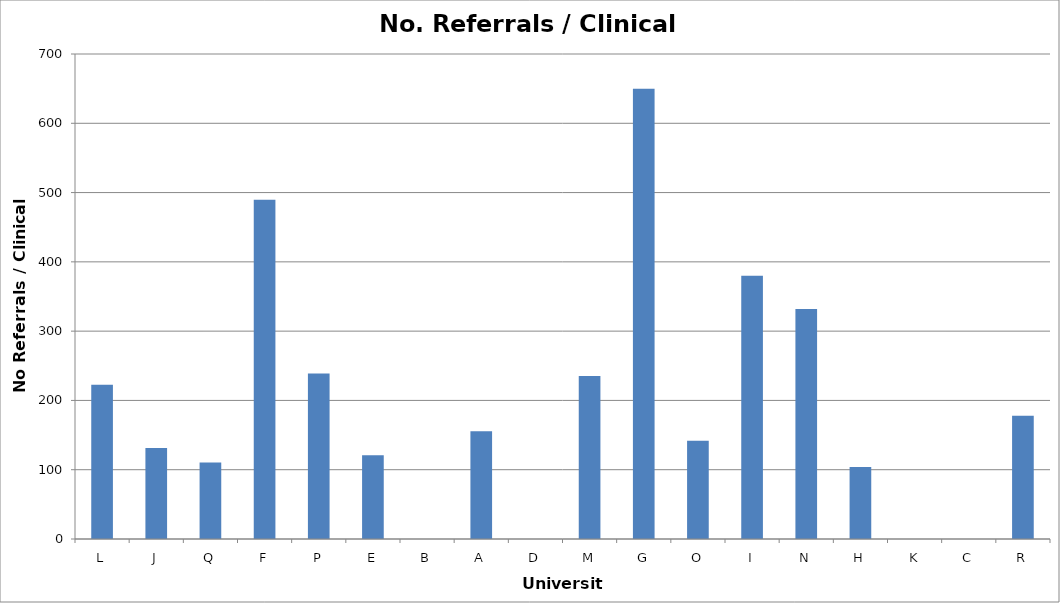
| Category | No. Referrals / Clinical FTE |
|---|---|
| L | 222.5 |
| J | 131.2 |
| Q | 110.385 |
| F | 489.73 |
| P | 238.75 |
| E | 120.833 |
| B | 0 |
| A | 155.556 |
| D | 0 |
| M | 235.294 |
| G | 650 |
| O | 141.905 |
| I | 380 |
| N | 332 |
| H | 104.091 |
| K | 0 |
| C | 0 |
| R | 178.039 |